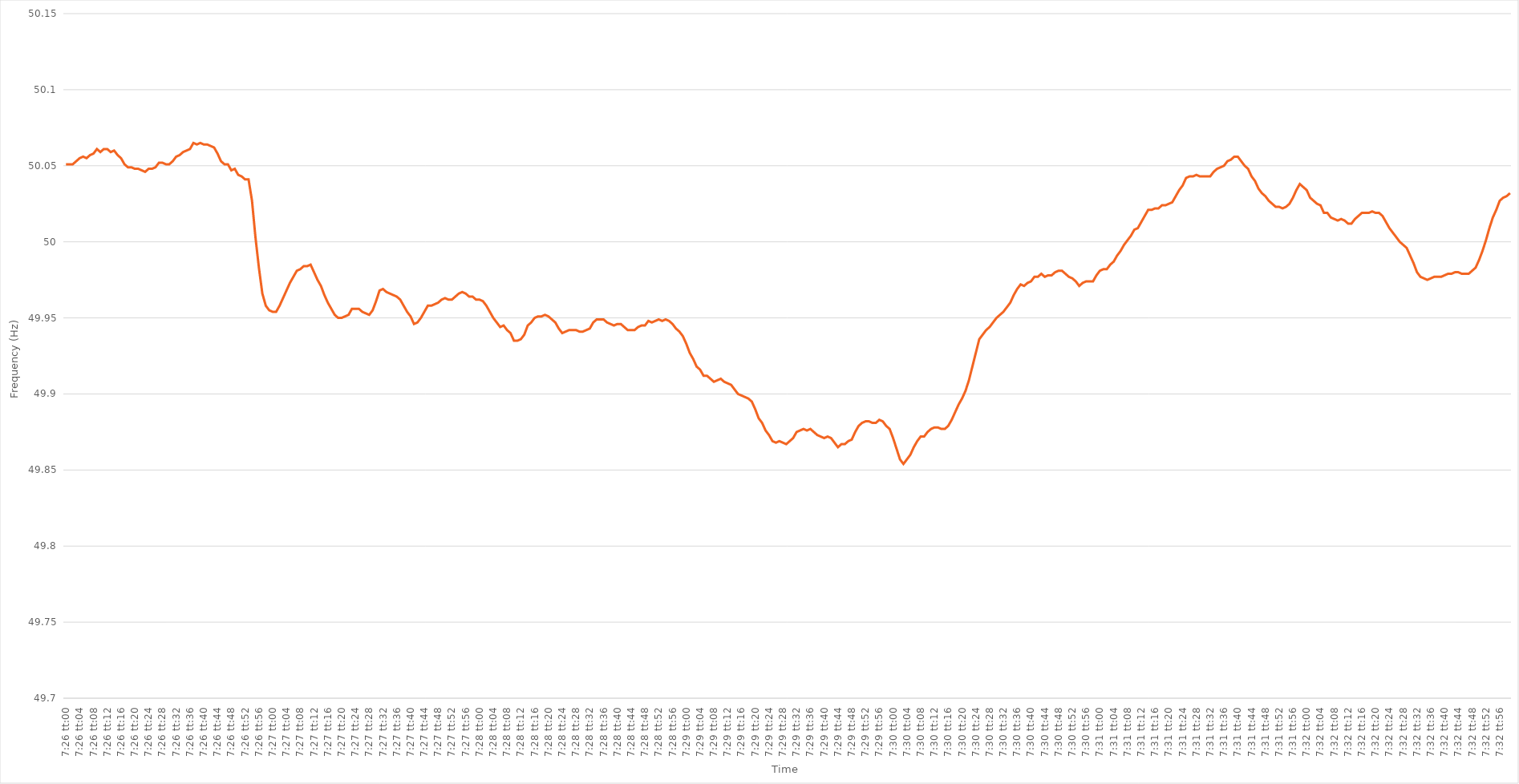
| Category | Series 0 |
|---|---|
| 0.30972222222222223 | 50.051 |
| 0.3097337962962963 | 50.051 |
| 0.30974537037037037 | 50.051 |
| 0.30975694444444446 | 50.053 |
| 0.30976851851851855 | 50.055 |
| 0.3097800925925926 | 50.056 |
| 0.30979166666666663 | 50.055 |
| 0.3098032407407407 | 50.057 |
| 0.3098148148148148 | 50.058 |
| 0.30982638888888886 | 50.061 |
| 0.30983796296296295 | 50.059 |
| 0.30984953703703705 | 50.061 |
| 0.3098611111111111 | 50.061 |
| 0.3098726851851852 | 50.059 |
| 0.3098842592592593 | 50.06 |
| 0.3098958333333333 | 50.057 |
| 0.3099074074074074 | 50.055 |
| 0.3099189814814815 | 50.051 |
| 0.30993055555555554 | 50.049 |
| 0.30994212962962964 | 50.049 |
| 0.30995370370370373 | 50.048 |
| 0.30996527777777777 | 50.048 |
| 0.30997685185185186 | 50.047 |
| 0.30998842592592596 | 50.046 |
| 0.31 | 50.048 |
| 0.3100115740740741 | 50.048 |
| 0.31002314814814813 | 50.049 |
| 0.3100347222222222 | 50.052 |
| 0.31004629629629626 | 50.052 |
| 0.31005787037037036 | 50.051 |
| 0.31006944444444445 | 50.051 |
| 0.3100810185185185 | 50.053 |
| 0.3100925925925926 | 50.056 |
| 0.3101041666666667 | 50.057 |
| 0.3101157407407407 | 50.059 |
| 0.3101273148148148 | 50.06 |
| 0.3101388888888889 | 50.061 |
| 0.31015046296296295 | 50.065 |
| 0.31016203703703704 | 50.064 |
| 0.31017361111111114 | 50.065 |
| 0.3101851851851852 | 50.064 |
| 0.31019675925925927 | 50.064 |
| 0.31020833333333336 | 50.063 |
| 0.3102199074074074 | 50.062 |
| 0.3102314814814815 | 50.058 |
| 0.3102430555555556 | 50.053 |
| 0.31025462962962963 | 50.051 |
| 0.31026620370370367 | 50.051 |
| 0.31027777777777776 | 50.047 |
| 0.31028935185185186 | 50.048 |
| 0.3103009259259259 | 50.044 |
| 0.3103125 | 50.043 |
| 0.3103240740740741 | 50.041 |
| 0.3103356481481481 | 50.041 |
| 0.3103472222222222 | 50.027 |
| 0.3103587962962963 | 50.003 |
| 0.31037037037037035 | 49.983 |
| 0.31038194444444445 | 49.966 |
| 0.31039351851851854 | 49.958 |
| 0.3104050925925926 | 49.955 |
| 0.3104166666666667 | 49.954 |
| 0.31042824074074077 | 49.954 |
| 0.3104398148148148 | 49.958 |
| 0.3104513888888889 | 49.963 |
| 0.310462962962963 | 49.968 |
| 0.31047453703703703 | 49.973 |
| 0.31048611111111113 | 49.977 |
| 0.31049768518518517 | 49.981 |
| 0.31050925925925926 | 49.982 |
| 0.3105208333333333 | 49.984 |
| 0.3105324074074074 | 49.984 |
| 0.3105439814814815 | 49.985 |
| 0.31055555555555553 | 49.98 |
| 0.3105671296296296 | 49.975 |
| 0.3105787037037037 | 49.971 |
| 0.31059027777777776 | 49.965 |
| 0.31060185185185185 | 49.96 |
| 0.31061342592592595 | 49.956 |
| 0.310625 | 49.952 |
| 0.3106365740740741 | 49.95 |
| 0.3106481481481482 | 49.95 |
| 0.3106597222222222 | 49.951 |
| 0.3106712962962963 | 49.952 |
| 0.3106828703703704 | 49.956 |
| 0.31069444444444444 | 49.956 |
| 0.31070601851851853 | 49.956 |
| 0.31071759259259263 | 49.954 |
| 0.31072916666666667 | 49.953 |
| 0.3107407407407407 | 49.952 |
| 0.3107523148148148 | 49.955 |
| 0.3107638888888889 | 49.961 |
| 0.31077546296296293 | 49.968 |
| 0.31078703703703703 | 49.969 |
| 0.3107986111111111 | 49.967 |
| 0.31081018518518516 | 49.966 |
| 0.31082175925925926 | 49.965 |
| 0.31083333333333335 | 49.964 |
| 0.3108449074074074 | 49.962 |
| 0.3108564814814815 | 49.958 |
| 0.3108680555555556 | 49.954 |
| 0.3108796296296296 | 49.951 |
| 0.3108912037037037 | 49.946 |
| 0.3109027777777778 | 49.947 |
| 0.31091435185185184 | 49.95 |
| 0.31092592592592594 | 49.954 |
| 0.31093750000000003 | 49.958 |
| 0.31094907407407407 | 49.958 |
| 0.31096064814814817 | 49.959 |
| 0.3109722222222222 | 49.96 |
| 0.3109837962962963 | 49.962 |
| 0.31099537037037034 | 49.963 |
| 0.31100694444444443 | 49.962 |
| 0.3110185185185185 | 49.962 |
| 0.31103009259259257 | 49.964 |
| 0.31104166666666666 | 49.966 |
| 0.31105324074074076 | 49.967 |
| 0.3110648148148148 | 49.966 |
| 0.3110763888888889 | 49.964 |
| 0.311087962962963 | 49.964 |
| 0.311099537037037 | 49.962 |
| 0.3111111111111111 | 49.962 |
| 0.3111226851851852 | 49.961 |
| 0.31113425925925925 | 49.958 |
| 0.31114583333333334 | 49.954 |
| 0.31115740740740744 | 49.95 |
| 0.3111689814814815 | 49.947 |
| 0.31118055555555557 | 49.944 |
| 0.31119212962962967 | 49.945 |
| 0.3112037037037037 | 49.942 |
| 0.31121527777777774 | 49.94 |
| 0.31122685185185184 | 49.935 |
| 0.31123842592592593 | 49.935 |
| 0.31124999999999997 | 49.936 |
| 0.31126157407407407 | 49.939 |
| 0.31127314814814816 | 49.945 |
| 0.3112847222222222 | 49.947 |
| 0.3112962962962963 | 49.95 |
| 0.3113078703703704 | 49.951 |
| 0.3113194444444444 | 49.951 |
| 0.3113310185185185 | 49.952 |
| 0.3113425925925926 | 49.951 |
| 0.31135416666666665 | 49.949 |
| 0.31136574074074075 | 49.947 |
| 0.31137731481481484 | 49.943 |
| 0.3113888888888889 | 49.94 |
| 0.311400462962963 | 49.941 |
| 0.31141203703703707 | 49.942 |
| 0.3114236111111111 | 49.942 |
| 0.31143518518518515 | 49.942 |
| 0.31144675925925924 | 49.941 |
| 0.31145833333333334 | 49.941 |
| 0.3114699074074074 | 49.942 |
| 0.31148148148148147 | 49.943 |
| 0.31149305555555556 | 49.947 |
| 0.3115046296296296 | 49.949 |
| 0.3115162037037037 | 49.949 |
| 0.3115277777777778 | 49.949 |
| 0.31153935185185183 | 49.947 |
| 0.3115509259259259 | 49.946 |
| 0.3115625 | 49.945 |
| 0.31157407407407406 | 49.946 |
| 0.31158564814814815 | 49.946 |
| 0.31159722222222225 | 49.944 |
| 0.3116087962962963 | 49.942 |
| 0.3116203703703704 | 49.942 |
| 0.3116319444444445 | 49.942 |
| 0.3116435185185185 | 49.944 |
| 0.3116550925925926 | 49.945 |
| 0.3116666666666667 | 49.945 |
| 0.31167824074074074 | 49.948 |
| 0.3116898148148148 | 49.947 |
| 0.3117013888888889 | 49.948 |
| 0.31171296296296297 | 49.949 |
| 0.311724537037037 | 49.948 |
| 0.3117361111111111 | 49.949 |
| 0.3117476851851852 | 49.948 |
| 0.31175925925925924 | 49.946 |
| 0.31177083333333333 | 49.943 |
| 0.3117824074074074 | 49.941 |
| 0.31179398148148146 | 49.938 |
| 0.31180555555555556 | 49.933 |
| 0.31181712962962965 | 49.927 |
| 0.3118287037037037 | 49.923 |
| 0.3118402777777778 | 49.918 |
| 0.3118518518518519 | 49.916 |
| 0.3118634259259259 | 49.912 |
| 0.311875 | 49.912 |
| 0.3118865740740741 | 49.91 |
| 0.31189814814814815 | 49.908 |
| 0.3119097222222222 | 49.909 |
| 0.3119212962962963 | 49.91 |
| 0.3119328703703704 | 49.908 |
| 0.3119444444444444 | 49.907 |
| 0.3119560185185185 | 49.906 |
| 0.3119675925925926 | 49.903 |
| 0.31197916666666664 | 49.9 |
| 0.31199074074074074 | 49.899 |
| 0.31200231481481483 | 49.898 |
| 0.31201388888888887 | 49.897 |
| 0.31202546296296296 | 49.895 |
| 0.31203703703703706 | 49.89 |
| 0.3120486111111111 | 49.884 |
| 0.3120601851851852 | 49.881 |
| 0.3120717592592593 | 49.876 |
| 0.3120833333333333 | 49.873 |
| 0.3120949074074074 | 49.869 |
| 0.3121064814814815 | 49.868 |
| 0.31211805555555555 | 49.869 |
| 0.31212962962962965 | 49.868 |
| 0.31214120370370374 | 49.867 |
| 0.3121527777777778 | 49.869 |
| 0.3121643518518518 | 49.871 |
| 0.3121759259259259 | 49.875 |
| 0.3121875 | 49.876 |
| 0.31219907407407405 | 49.877 |
| 0.31221064814814814 | 49.876 |
| 0.31222222222222223 | 49.877 |
| 0.3122337962962963 | 49.875 |
| 0.31224537037037037 | 49.873 |
| 0.31225694444444446 | 49.872 |
| 0.3122685185185185 | 49.871 |
| 0.3122800925925926 | 49.872 |
| 0.3122916666666667 | 49.871 |
| 0.31230324074074073 | 49.868 |
| 0.3123148148148148 | 49.865 |
| 0.3123263888888889 | 49.867 |
| 0.31233796296296296 | 49.867 |
| 0.31234953703703705 | 49.869 |
| 0.31236111111111114 | 49.87 |
| 0.3123726851851852 | 49.875 |
| 0.3123842592592592 | 49.879 |
| 0.3123958333333333 | 49.881 |
| 0.3124074074074074 | 49.882 |
| 0.31241898148148145 | 49.882 |
| 0.31243055555555554 | 49.881 |
| 0.31244212962962964 | 49.881 |
| 0.3124537037037037 | 49.883 |
| 0.3124652777777778 | 49.882 |
| 0.31247685185185187 | 49.879 |
| 0.3124884259259259 | 49.877 |
| 0.3125 | 49.871 |
| 0.3125115740740741 | 49.864 |
| 0.31252314814814813 | 49.857 |
| 0.3125347222222222 | 49.854 |
| 0.3125462962962963 | 49.857 |
| 0.31255787037037036 | 49.86 |
| 0.31256944444444446 | 49.865 |
| 0.31258101851851855 | 49.869 |
| 0.3125925925925926 | 49.872 |
| 0.3126041666666666 | 49.872 |
| 0.3126157407407408 | 49.875 |
| 0.3126273148148148 | 49.877 |
| 0.31263888888888886 | 49.878 |
| 0.31265046296296295 | 49.878 |
| 0.31266203703703704 | 49.877 |
| 0.3126736111111111 | 49.877 |
| 0.3126851851851852 | 49.879 |
| 0.31269675925925927 | 49.883 |
| 0.3127083333333333 | 49.888 |
| 0.3127199074074074 | 49.893 |
| 0.3127314814814815 | 49.897 |
| 0.31274305555555554 | 49.902 |
| 0.31275462962962963 | 49.909 |
| 0.3127662037037037 | 49.918 |
| 0.31277777777777777 | 49.927 |
| 0.31278935185185186 | 49.936 |
| 0.31280092592592595 | 49.939 |
| 0.3128125 | 49.942 |
| 0.3128240740740741 | 49.944 |
| 0.3128356481481482 | 49.947 |
| 0.3128472222222222 | 49.95 |
| 0.3128587962962963 | 49.952 |
| 0.31287037037037035 | 49.954 |
| 0.31288194444444445 | 49.957 |
| 0.3128935185185185 | 49.96 |
| 0.3129050925925926 | 49.965 |
| 0.3129166666666667 | 49.969 |
| 0.3129282407407407 | 49.972 |
| 0.3129398148148148 | 49.971 |
| 0.3129513888888889 | 49.973 |
| 0.31296296296296294 | 49.974 |
| 0.31297453703703704 | 49.977 |
| 0.31298611111111113 | 49.977 |
| 0.31299768518518517 | 49.979 |
| 0.31300925925925926 | 49.977 |
| 0.31302083333333336 | 49.978 |
| 0.3130324074074074 | 49.978 |
| 0.3130439814814815 | 49.98 |
| 0.3130555555555556 | 49.981 |
| 0.3130671296296296 | 49.981 |
| 0.3130787037037037 | 49.979 |
| 0.31309027777777776 | 49.977 |
| 0.31310185185185185 | 49.976 |
| 0.3131134259259259 | 49.974 |
| 0.313125 | 49.971 |
| 0.3131365740740741 | 49.973 |
| 0.3131481481481481 | 49.974 |
| 0.3131597222222222 | 49.974 |
| 0.3131712962962963 | 49.974 |
| 0.31318287037037035 | 49.978 |
| 0.31319444444444444 | 49.981 |
| 0.31320601851851854 | 49.982 |
| 0.3132175925925926 | 49.982 |
| 0.31322916666666667 | 49.985 |
| 0.31324074074074076 | 49.987 |
| 0.3132523148148148 | 49.991 |
| 0.3132638888888889 | 49.994 |
| 0.313275462962963 | 49.998 |
| 0.31328703703703703 | 50.001 |
| 0.3132986111111111 | 50.004 |
| 0.3133101851851852 | 50.008 |
| 0.31332175925925926 | 50.009 |
| 0.3133333333333333 | 50.013 |
| 0.3133449074074074 | 50.017 |
| 0.3133564814814815 | 50.021 |
| 0.3133680555555555 | 50.021 |
| 0.3133796296296296 | 50.022 |
| 0.3133912037037037 | 50.022 |
| 0.31340277777777775 | 50.024 |
| 0.31341435185185185 | 50.024 |
| 0.31342592592592594 | 50.025 |
| 0.3134375 | 50.026 |
| 0.3134490740740741 | 50.03 |
| 0.31346064814814817 | 50.034 |
| 0.3134722222222222 | 50.037 |
| 0.3134837962962963 | 50.042 |
| 0.3134953703703704 | 50.043 |
| 0.31350694444444444 | 50.043 |
| 0.31351851851851853 | 50.044 |
| 0.3135300925925926 | 50.043 |
| 0.31354166666666666 | 50.043 |
| 0.3135532407407407 | 50.043 |
| 0.31356481481481485 | 50.043 |
| 0.3135763888888889 | 50.046 |
| 0.31358796296296293 | 50.048 |
| 0.313599537037037 | 50.049 |
| 0.3136111111111111 | 50.05 |
| 0.31362268518518516 | 50.053 |
| 0.31363425925925925 | 50.054 |
| 0.31364583333333335 | 50.056 |
| 0.3136574074074074 | 50.056 |
| 0.3136689814814815 | 50.053 |
| 0.3136805555555556 | 50.05 |
| 0.3136921296296296 | 50.048 |
| 0.3137037037037037 | 50.043 |
| 0.3137152777777778 | 50.04 |
| 0.31372685185185184 | 50.035 |
| 0.31373842592592593 | 50.032 |
| 0.31375000000000003 | 50.03 |
| 0.31376157407407407 | 50.027 |
| 0.31377314814814816 | 50.025 |
| 0.31378472222222226 | 50.023 |
| 0.3137962962962963 | 50.023 |
| 0.3138078703703704 | 50.022 |
| 0.31381944444444443 | 50.023 |
| 0.3138310185185185 | 50.025 |
| 0.31384259259259256 | 50.029 |
| 0.31385416666666666 | 50.034 |
| 0.31386574074074075 | 50.038 |
| 0.3138773148148148 | 50.036 |
| 0.3138888888888889 | 50.034 |
| 0.313900462962963 | 50.029 |
| 0.313912037037037 | 50.027 |
| 0.3139236111111111 | 50.025 |
| 0.3139351851851852 | 50.024 |
| 0.31394675925925924 | 50.019 |
| 0.31395833333333334 | 50.019 |
| 0.31396990740740743 | 50.016 |
| 0.3139814814814815 | 50.015 |
| 0.31399305555555557 | 50.014 |
| 0.31400462962962966 | 50.015 |
| 0.3140162037037037 | 50.014 |
| 0.3140277777777778 | 50.012 |
| 0.31403935185185183 | 50.012 |
| 0.31405092592592593 | 50.015 |
| 0.31406249999999997 | 50.017 |
| 0.31407407407407406 | 50.019 |
| 0.31408564814814816 | 50.019 |
| 0.3140972222222222 | 50.019 |
| 0.3141087962962963 | 50.02 |
| 0.3141203703703704 | 50.019 |
| 0.3141319444444444 | 50.019 |
| 0.3141435185185185 | 50.017 |
| 0.3141550925925926 | 50.013 |
| 0.31416666666666665 | 50.009 |
| 0.31417824074074074 | 50.006 |
| 0.31418981481481484 | 50.003 |
| 0.3142013888888889 | 50 |
| 0.31421296296296297 | 49.998 |
| 0.31422453703703707 | 49.996 |
| 0.3142361111111111 | 49.991 |
| 0.3142476851851852 | 49.986 |
| 0.31425925925925924 | 49.98 |
| 0.31427083333333333 | 49.977 |
| 0.31428240740740737 | 49.976 |
| 0.3142939814814815 | 49.975 |
| 0.31430555555555556 | 49.976 |
| 0.3143171296296296 | 49.977 |
| 0.3143287037037037 | 49.977 |
| 0.3143402777777778 | 49.977 |
| 0.3143518518518518 | 49.978 |
| 0.3143634259259259 | 49.979 |
| 0.314375 | 49.979 |
| 0.31438657407407405 | 49.98 |
| 0.31439814814814815 | 49.98 |
| 0.31440972222222224 | 49.979 |
| 0.3144212962962963 | 49.979 |
| 0.3144328703703704 | 49.979 |
| 0.31444444444444447 | 49.981 |
| 0.3144560185185185 | 49.983 |
| 0.3144675925925926 | 49.988 |
| 0.3144791666666667 | 49.994 |
| 0.31449074074074074 | 50.001 |
| 0.3145023148148148 | 50.009 |
| 0.3145138888888889 | 50.016 |
| 0.31452546296296297 | 50.021 |
| 0.314537037037037 | 50.027 |
| 0.3145486111111111 | 50.029 |
| 0.3145601851851852 | 50.03 |
| 0.31457175925925923 | 50.032 |